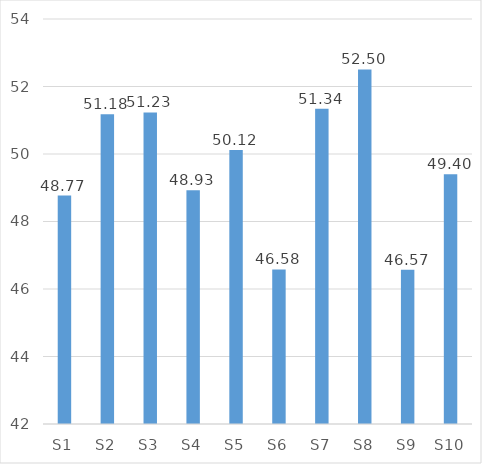
| Category | Mean |
|---|---|
| S1 | 48.767 |
| S2 | 51.178 |
| S3 | 51.233 |
| S4 | 48.927 |
| S5 | 50.117 |
| S6 | 46.579 |
| S7 | 51.343 |
| S8 | 52.504 |
| S9 | 46.567 |
| S10 | 49.401 |